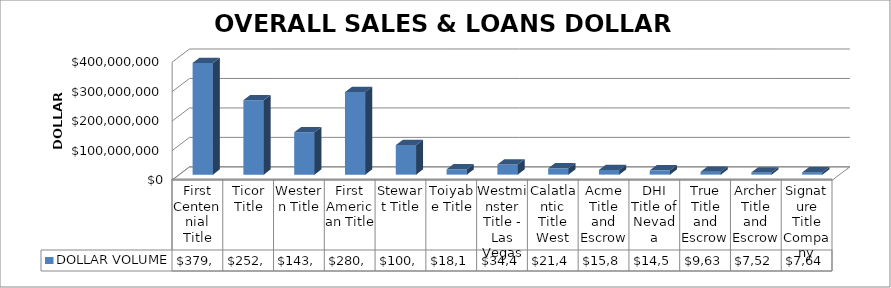
| Category | DOLLAR VOLUME |
|---|---|
| First Centennial Title | 379054075.35 |
| Ticor Title | 252817630.01 |
| Western Title | 143825396 |
| First American Title | 280024804 |
| Stewart Title | 100137857.6 |
| Toiyabe Title | 18105210 |
| Westminster Title - Las Vegas | 34487525 |
| Calatlantic Title West | 21447087 |
| Acme Title and Escrow | 15875299 |
| DHI Title of Nevada | 14500881.21 |
| True Title and Escrow | 9632649 |
| Archer Title and Escrow | 7525487 |
| Signature Title Company | 7647120 |